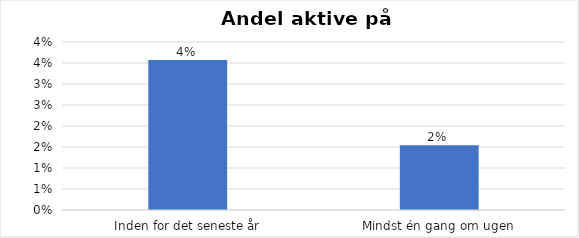
| Category | % |
|---|---|
| Inden for det seneste år | 0.036 |
| Mindst én gang om ugen | 0.015 |